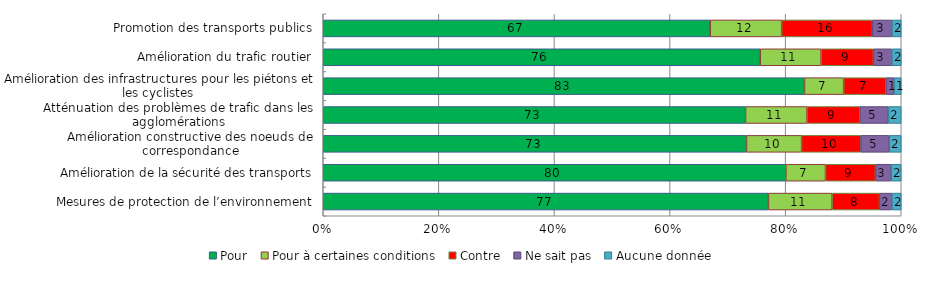
| Category | Pour | Pour à certaines conditions | Contre | Ne sait pas | Aucune donnée |
|---|---|---|---|---|---|
| Promotion des transports publics | 66.959 | 12.354 | 15.697 | 3.378 | 1.612 |
| Amélioration du trafic routier | 75.602 | 10.54 | 9.033 | 3.185 | 1.64 |
| Amélioration des infrastructures pour les piétons et les cyclistes | 83.26 | 6.779 | 7.308 | 1.415 | 1.239 |
| Atténuation des problèmes de trafic dans les agglomérations | 73.064 | 10.64 | 9.131 | 4.944 | 2.22 |
| Amélioration constructive des noeuds de correspondance | 73.225 | 9.531 | 10.242 | 4.942 | 2.06 |
| Amélioration de la sécurité des transports | 80.039 | 6.86 | 8.632 | 2.722 | 1.747 |
| Mesures de protection de l’environnement | 77.025 | 11.023 | 8.17 | 2.163 | 1.619 |